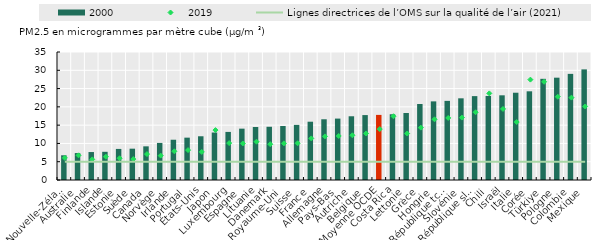
| Category | 2000 |
|---|---|
| Nouvelle­Zélande | 6.757 |
| Australie | 7.366 |
| Finlande | 7.646 |
| Islande | 7.711 |
| Estonie | 8.499 |
| Suède | 8.564 |
| Canada | 9.204 |
| Norvège | 10.138 |
| Irlande | 11.011 |
| Portugal | 11.581 |
| États­Unis | 11.959 |
| Japon | 12.984 |
| Luxembourg | 13.148 |
| Espagne | 14.039 |
| Lituanie | 14.501 |
| Danemark | 14.558 |
| Royaume­Uni | 14.764 |
| Suisse | 15.073 |
| France | 15.939 |
| Allemagne | 16.606 |
| Pays­Bas | 16.793 |
| Autriche | 17.429 |
| Belgique | 17.751 |
| Moyenne OCDE | 17.8 |
| Costa Rica | 17.974 |
| Lettonie | 18.316 |
| Grèce | 20.779 |
| Hongrie | 21.5 |
| République tchèque | 21.636 |
| Slovénie | 22.336 |
| République slovaque | 22.937 |
| Chili | 22.98 |
| Israël | 23.156 |
| Italie | 23.864 |
| Corée | 24.251 |
| Türkiye | 27.667 |
| Pologne | 27.979 |
| Colombie | 29.02 |
| Mexique | 30.248 |